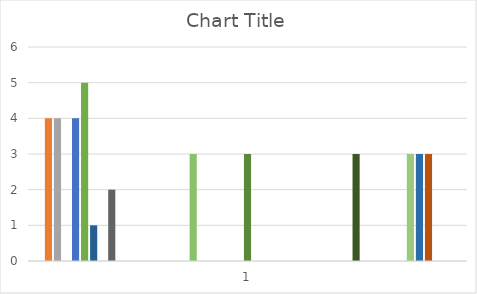
| Category | Series 0 | Series 1 | Series 2 | Series 3 | Series 4 | Series 5 | Series 6 | Series 7 | Series 8 | Series 9 | Series 10 | Series 11 | Series 12 | Series 13 | Series 14 | Series 15 | Series 16 | Series 17 | Series 18 | Series 19 | Series 20 | Series 21 | Series 22 | Series 23 | Series 24 | Series 25 | Series 26 | Series 27 | Series 28 | Series 29 | Series 30 | Series 31 | Series 32 | Series 33 | Series 34 | Series 35 | Series 36 | Series 37 | Series 38 | Series 39 | Series 40 | Series 41 | Series 42 | Series 43 | Series 44 | Series 45 | Series 46 |
|---|---|---|---|---|---|---|---|---|---|---|---|---|---|---|---|---|---|---|---|---|---|---|---|---|---|---|---|---|---|---|---|---|---|---|---|---|---|---|---|---|---|---|---|---|---|---|---|
| 0 | 0 | 4 | 4 | 0 | 4 | 5 | 1 | 0 | 2 | 0 | 0 | 0 | 0 | 0 | 0 | 0 | 0 | 3 | 0 | 0 | 0 | 0 | 0 | 3 | 0 | 0 | 0 | 0 | 0 | 0 | 0 | 0 | 0 | 0 | 0 | 3 | 0 | 0 | 0 | 0 | 0 | 3 | 3 | 3 | 0 | 0 | 0 |